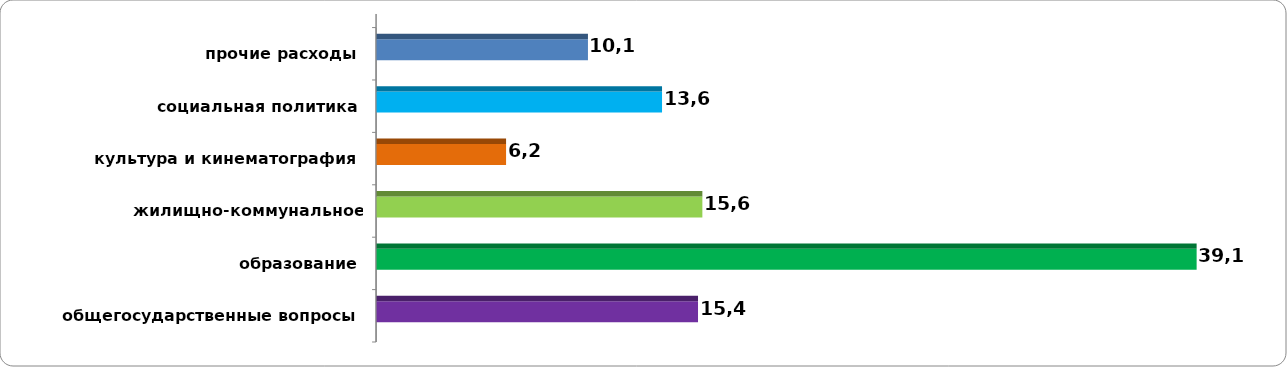
| Category | Series 0 |
|---|---|
| общегосударственные вопросы | 15.356 |
| образование | 39.133 |
| жилищно-коммунальное хозяйство | 15.563 |
| культура и кинематография | 6.202 |
| социальная политика | 13.64 |
| прочие расходы | 10.107 |